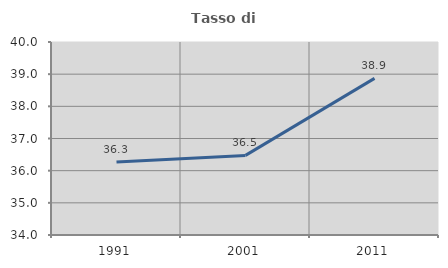
| Category | Tasso di occupazione   |
|---|---|
| 1991.0 | 36.267 |
| 2001.0 | 36.475 |
| 2011.0 | 38.868 |